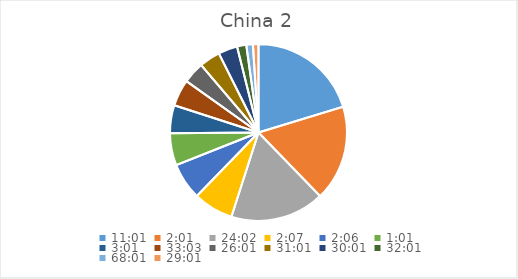
| Category | Series 0 |
|---|---|
| 0.4590277777777778 | 21.72 |
| 0.08402777777777777 | 18.694 |
| 1.0013888888888889 | 18.405 |
| 0.08819444444444445 | 7.839 |
| 0.08750000000000001 | 7.198 |
| 0.042361111111111106 | 6.285 |
| 0.12569444444444444 | 5.457 |
| 1.3770833333333332 | 5.229 |
| 1.0840277777777778 | 4.216 |
| 1.292361111111111 | 4.082 |
| 1.2506944444444443 | 3.749 |
| 1.3340277777777778 | 1.798 |
| 2.8340277777777776 | 1.29 |
| 1.2090277777777778 | 1.079 |